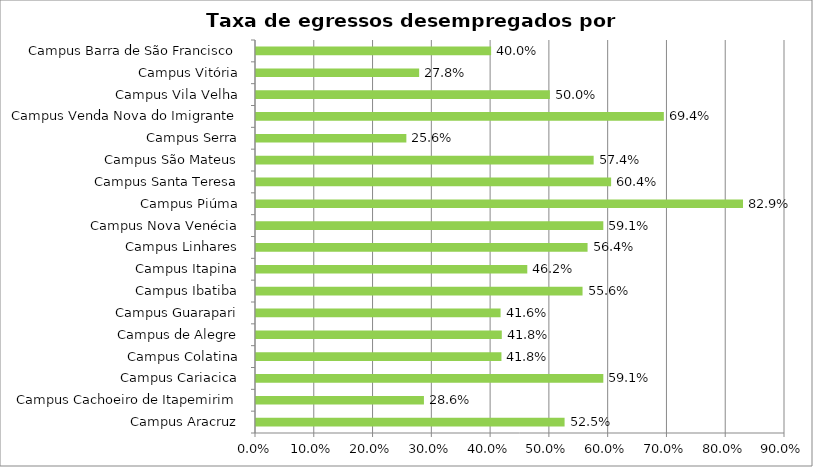
| Category | Series 0 |
|---|---|
| Campus Aracruz | 0.525 |
| Campus Cachoeiro de Itapemirim | 0.286 |
| Campus Cariacica | 0.591 |
| Campus Colatina | 0.418 |
| Campus de Alegre | 0.418 |
| Campus Guarapari | 0.416 |
| Campus Ibatiba | 0.556 |
| Campus Itapina | 0.462 |
| Campus Linhares | 0.564 |
| Campus Nova Venécia | 0.591 |
| Campus Piúma | 0.829 |
| Campus Santa Teresa | 0.604 |
| Campus São Mateus | 0.574 |
| Campus Serra | 0.256 |
| Campus Venda Nova do Imigrante | 0.694 |
| Campus Vila Velha | 0.5 |
| Campus Vitória | 0.278 |
| Campus Barra de São Francisco | 0.4 |